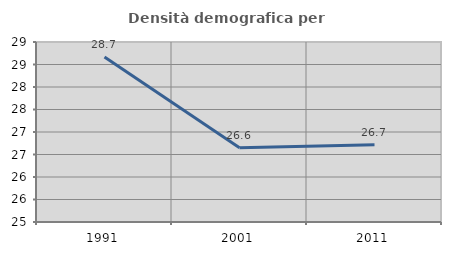
| Category | Densità demografica |
|---|---|
| 1991.0 | 28.667 |
| 2001.0 | 26.649 |
| 2011.0 | 26.719 |